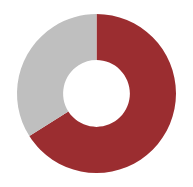
| Category | Retirement Plan |
|---|---|
| 0 | 0.66 |
| 1 | 0.34 |